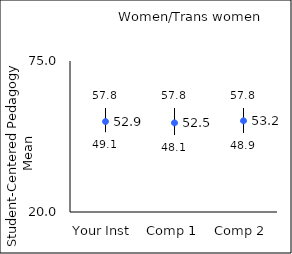
| Category | 25th percentile | 75th percentile | Mean |
|---|---|---|---|
| Your Inst | 49.1 | 57.8 | 52.94 |
| Comp 1 | 48.1 | 57.8 | 52.46 |
| Comp 2 | 48.9 | 57.8 | 53.22 |